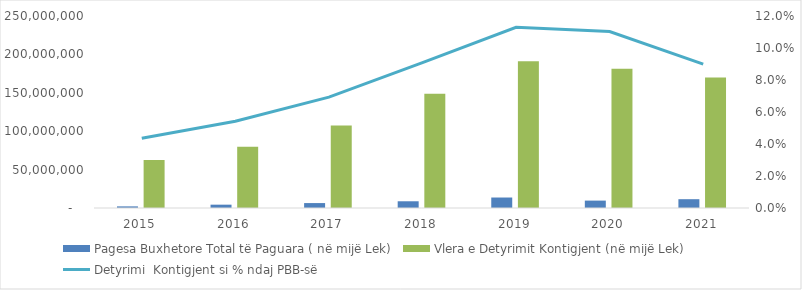
| Category | Pagesa Buxhetore Total të Paguara ( në mijë Lek) | Vlera e Detyrimit Kontigjent (në mijë Lek) |
|---|---|---|
| 2015.0 | 2109906 | 62446285 |
| 2016.0 | 4339039 | 79788457 |
| 2017.0 | 6418540 | 107464879 |
| 2018.0 | 8760645 | 148621256 |
| 2019.0 | 13652568 | 191005197 |
| 2020.0 | 9633636 | 181371561 |
| 2021.0 | 11467576 | 169903985 |